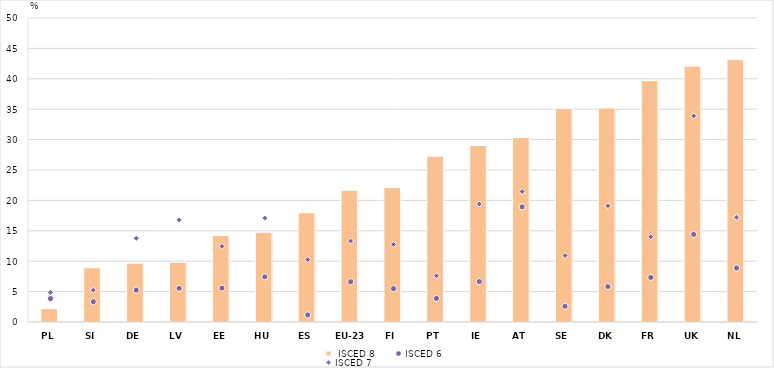
| Category |  ISCED 8 |
|---|---|
| 0 | 2.202 |
| 1 | 8.913 |
| 2 | 9.682 |
| 3 | 9.821 |
| 4 | 14.231 |
| 5 | 14.746 |
| 6 | 17.966 |
| 7 | 21.665 |
| 8 | 22.13 |
| 9 | 27.277 |
| 10 | 29.027 |
| 11 | 30.335 |
| 12 | 35.131 |
| 13 | 35.191 |
| 14 | 39.689 |
| 15 | 42.082 |
| 16 | 43.148 |